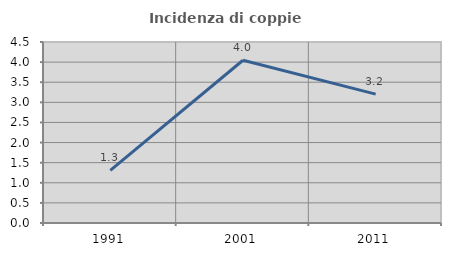
| Category | Incidenza di coppie miste |
|---|---|
| 1991.0 | 1.307 |
| 2001.0 | 4.046 |
| 2011.0 | 3.205 |